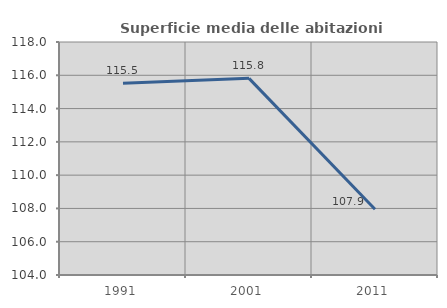
| Category | Superficie media delle abitazioni occupate |
|---|---|
| 1991.0 | 115.529 |
| 2001.0 | 115.816 |
| 2011.0 | 107.947 |